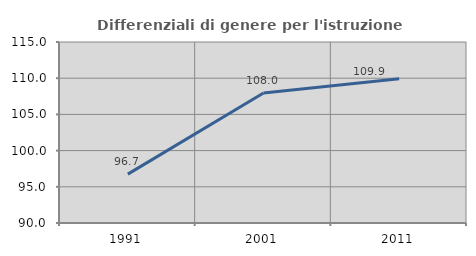
| Category | Differenziali di genere per l'istruzione superiore |
|---|---|
| 1991.0 | 96.747 |
| 2001.0 | 107.952 |
| 2011.0 | 109.913 |